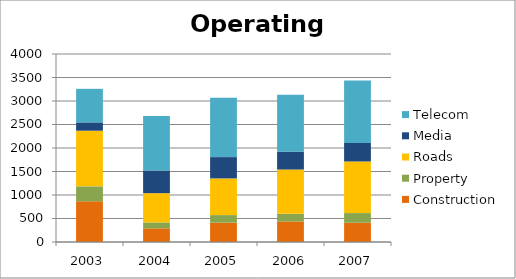
| Category | Construction | Property | Roads | Media | Telecom |
|---|---|---|---|---|---|
| 2003.0 | 866 | 318 | 1184 | 177 | 714 |
| 2004.0 | 291 | 125 | 623 | 483 | 1159 |
| 2005.0 | 411 | 161 | 781 | 453 | 1261 |
| 2006.0 | 437 | 163 | 942 | 380 | 1210 |
| 2007.0 | 410 | 205 | 1098 | 394 | 1330 |